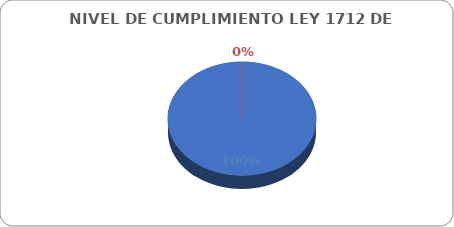
| Category | Series 0 |
|---|---|
| CUMPLIDOS | 115 |
| NO CUMPLIDOS | 0 |